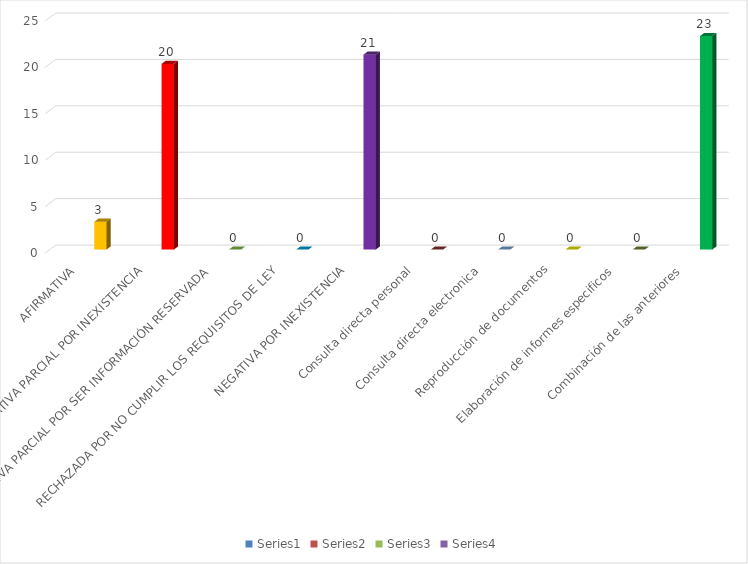
| Category | Series 0 | Series 1 | Series 2 | Series 3 |
|---|---|---|---|---|
| AFIRMATIVA |  |  |  | 3 |
| AFIRMATIVA PARCIAL POR INEXISTENCIA |  |  |  | 20 |
| AFIRMATIVA PARCIAL POR SER INFORMACIÓN RESERVADA |  |  |  | 0 |
| RECHAZADA POR NO CUMPLIR LOS REQUISITOS DE LEY |  |  |  | 0 |
| NEGATIVA POR INEXISTENCIA |  |  |  | 21 |
| Consulta directa personal |  |  |  | 0 |
| Consulta directa electronica |  |  |  | 0 |
| Reproducción de documentos |  |  |  | 0 |
| Elaboración de informes especificos |  |  |  | 0 |
| Combinación de las anteriores |  |  |  | 23 |